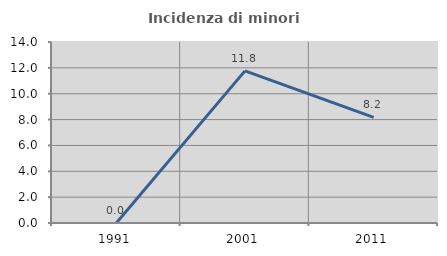
| Category | Incidenza di minori stranieri |
|---|---|
| 1991.0 | 0 |
| 2001.0 | 11.765 |
| 2011.0 | 8.163 |